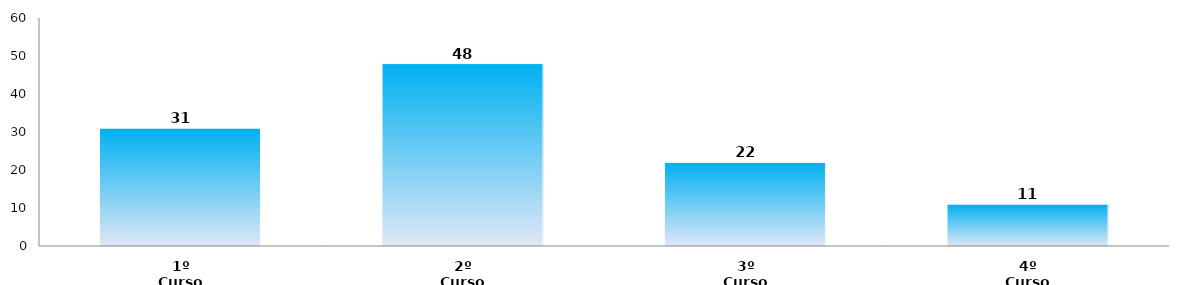
| Category | Series 0 |
|---|---|
| 1º Curso | 31 |
| 2º Curso | 48 |
| 3º Curso | 22 |
| 4º Curso | 11 |